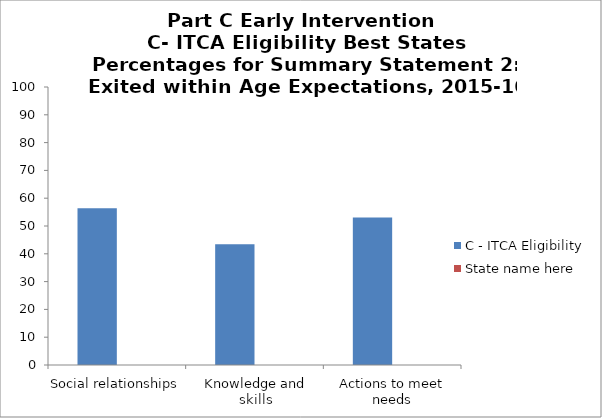
| Category | C - ITCA Eligibility | State name here |
|---|---|---|
| Social relationships | 56.4 |  |
| Knowledge and skills | 43.4 |  |
| Actions to meet needs | 53.1 |  |